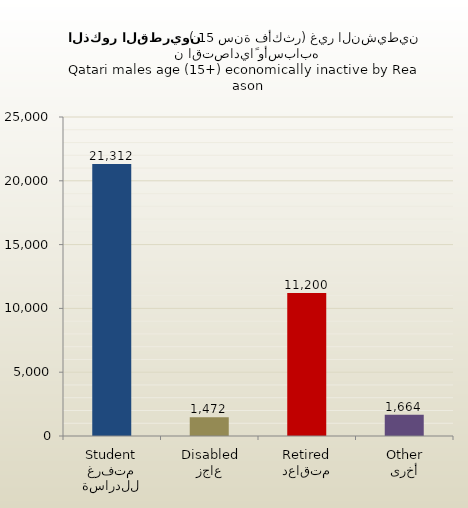
| Category | الذكور القطريين |
|---|---|
| متفرغ للدراسة
Student | 21312 |
| عاجز
Disabled | 1472 |
| متقاعد
Retired | 11200 |
| أخرى
Other | 1664 |